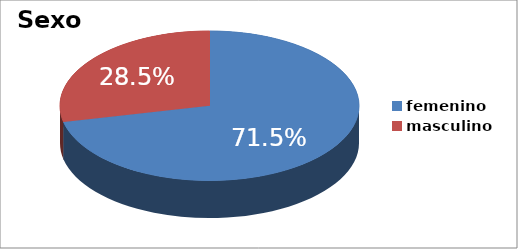
| Category | Series 0 |
|---|---|
| femenino | 0.715 |
| masculino | 0.285 |